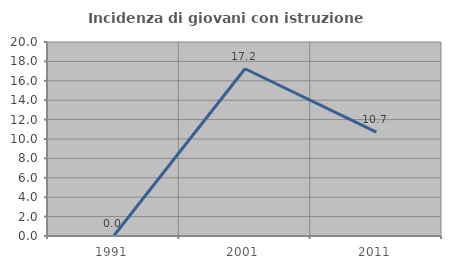
| Category | Incidenza di giovani con istruzione universitaria |
|---|---|
| 1991.0 | 0 |
| 2001.0 | 17.241 |
| 2011.0 | 10.714 |